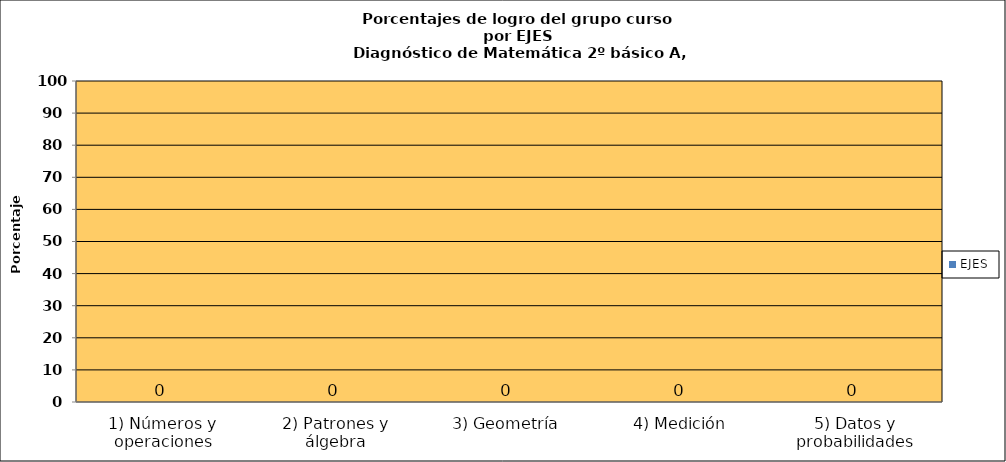
| Category | EJES |
|---|---|
| 1) Números y operaciones | 0 |
| 2) Patrones y álgebra | 0 |
| 3) Geometría | 0 |
| 4) Medición | 0 |
| 5) Datos y probabilidades | 0 |